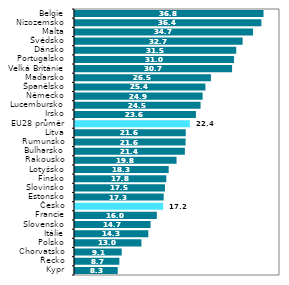
| Category | Series 0 |
|---|---|
| Kypr | 8.339 |
| Řecko | 8.657 |
| Chorvatsko | 9.118 |
| Polsko | 12.962 |
| Itálie | 14.305 |
| Slovensko | 14.746 |
| Francie | 15.967 |
| Česko | 17.203 |
| Estonsko | 17.3 |
| Slovinsko | 17.548 |
| Finsko | 17.815 |
| Lotyšsko | 18.282 |
| Rakousko | 19.815 |
| Bulharsko | 21.438 |
| Rumunsko | 21.573 |
| Litva | 21.607 |
| EU28 průměr | 22.42 |
| Irsko | 23.59 |
| Lucembursko | 24.498 |
| Německo | 24.899 |
| Španělsko | 25.448 |
| Maďarsko | 26.526 |
| Velká Británie | 30.651 |
| Portugalsko | 31.028 |
| Dánsko | 31.457 |
| Švédsko | 32.702 |
| Malta | 34.731 |
| Nizozemsko | 36.371 |
| Belgie | 36.783 |